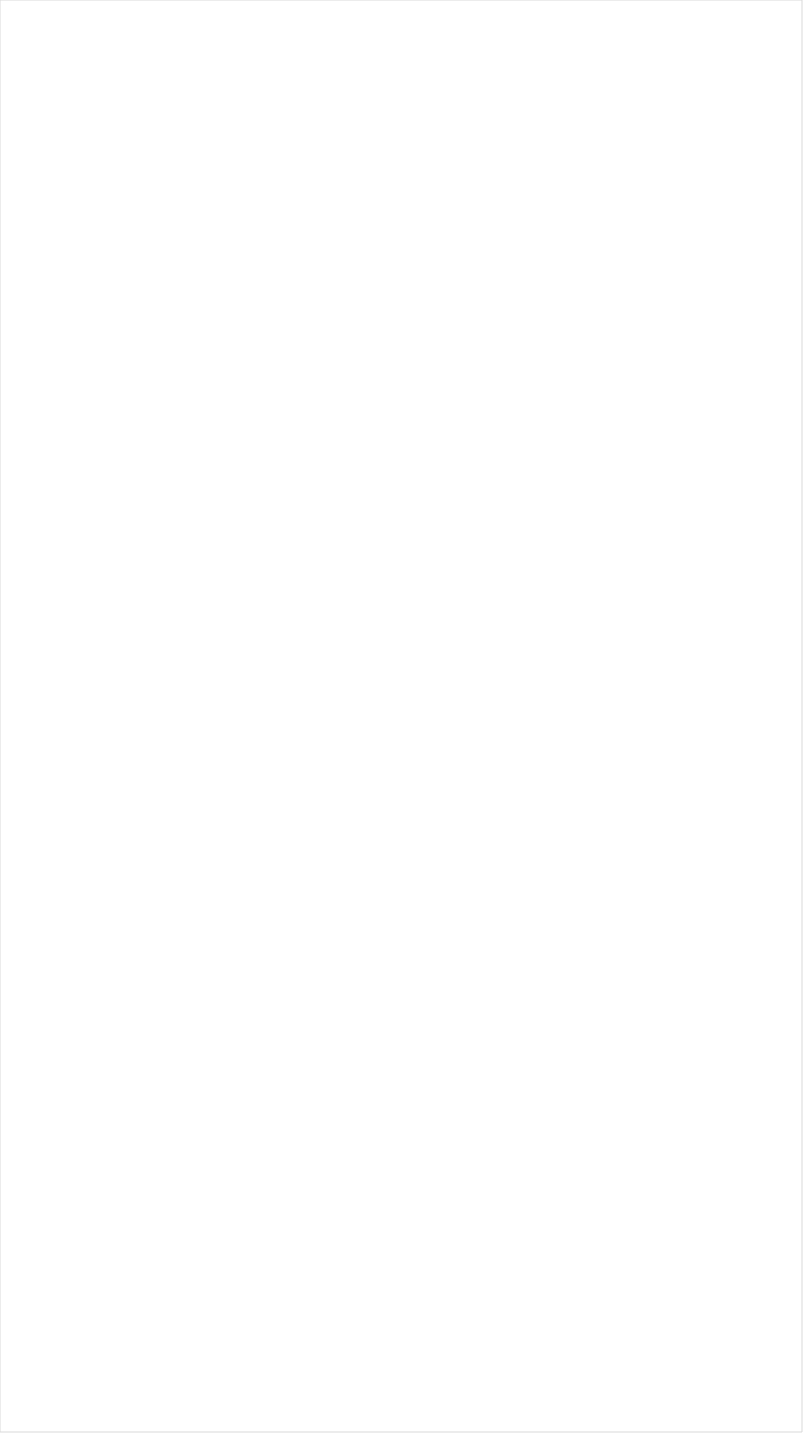
| Category | Total |
|---|---|
| Galavision | -0.908 |
| TUDN | -0.861 |
| UniMas | -0.857 |
| NBC Universo | -0.853 |
| ESPN Deportes | -0.849 |
| Telemundo | -0.826 |
| Univision | -0.806 |
| BET Her | -0.709 |
| Cartoon Network | -0.708 |
| Nick Toons | -0.675 |
| TV ONE | -0.625 |
| BET | -0.624 |
| VH1 | -0.621 |
| Disney XD | -0.548 |
| MTV2 | -0.543 |
| Adult Swim | -0.512 |
| Teen Nick | -0.506 |
| Discovery Life Channel | -0.495 |
| Lifetime Movies | -0.494 |
| Nick Jr. | -0.492 |
| Disney Channel | -0.484 |
| Nick | -0.476 |
| Lifetime | -0.433 |
| Travel | -0.382 |
| WE TV | -0.376 |
| Disney Junior US | -0.375 |
| Oprah Winfrey Network | -0.348 |
| Universal Kids | -0.343 |
| TLC | -0.323 |
| Nick@Nite | -0.311 |
| Logo | -0.311 |
| Investigation Discovery | -0.306 |
| OXYGEN | -0.256 |
| MTV | -0.248 |
| Paramount Network | -0.208 |
| UP TV | -0.2 |
| Discovery Family Channel | -0.195 |
| Freeform | -0.187 |
| USA Network | -0.163 |
| SYFY | -0.147 |
| FX | -0.143 |
| Hallmark | -0.141 |
| ION | -0.138 |
| Headline News | -0.13 |
| INSP | -0.123 |
| E! | -0.119 |
| Hallmark Movies & Mysteries | -0.115 |
| FXDEP | -0.114 |
| CW | -0.104 |
| A&E | -0.078 |
| BRAVO | -0.066 |
| TNT | -0.061 |
| truTV | -0.057 |
| TBS | -0.047 |
| FXX | -0.041 |
| FX Movie Channel | -0.014 |
| Animal Planet | 0.011 |
| NBA TV | 0.015 |
| FOX | 0.015 |
| Game Show | 0.025 |
| SundanceTV | 0.025 |
| Viceland | 0.027 |
| POP | 0.029 |
| TV LAND | 0.036 |
| Great American Country | 0.055 |
| CMTV | 0.057 |
| Science Channel | 0.064 |
| Ovation | 0.069 |
| History Channel | 0.085 |
| National Geographic Wild | 0.114 |
| FYI | 0.116 |
| MSNBC | 0.119 |
| HGTV | 0.122 |
| Motor Trend Network | 0.123 |
| Discovery Channel | 0.125 |
| Reelz Channel | 0.131 |
| Food Network | 0.133 |
| CNN | 0.138 |
| AMC | 0.142 |
| Comedy Central | 0.15 |
| ABC | 0.186 |
| MyNetworkTV | 0.194 |
| WGN America | 0.203 |
| American Heroes Channel | 0.219 |
| BBC America | 0.248 |
| Independent Film (IFC) | 0.251 |
| National Geographic | 0.252 |
| Cooking Channel | 0.297 |
| RFD TV | 0.31 |
| NBC | 0.335 |
| Smithsonian | 0.344 |
| Destination America | 0.349 |
| DIY | 0.38 |
| CNBC | 0.383 |
| CBS | 0.42 |
| Weather Channel | 0.427 |
| NFL Network | 0.444 |
| Fox News | 0.474 |
| The Sportsman Channel | 0.518 |
| PBS | 0.524 |
| Olympic Channel | 0.53 |
| Fox Sports 1 | 0.56 |
| Fox Business | 0.576 |
| Outdoor Channel | 0.601 |
| Bloomberg HD | 0.731 |
| NBC Sports | 0.81 |
| ESPN2 | 0.836 |
| ESPNEWS | 0.869 |
| ESPNU | 0.895 |
| Tennis Channel | 1.046 |
| CBS Sports | 1.069 |
| NHL | 1.346 |
| Big Ten Network | 1.38 |
| MLB Network | 1.393 |
| ESPN | 1.584 |
| PAC-12 Network | 1.616 |
| Golf | 6.06 |